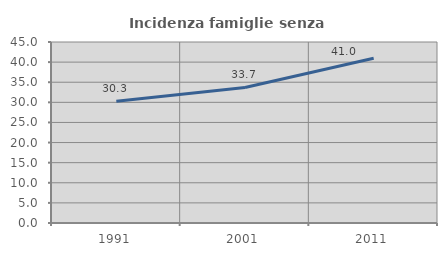
| Category | Incidenza famiglie senza nuclei |
|---|---|
| 1991.0 | 30.291 |
| 2001.0 | 33.708 |
| 2011.0 | 40.957 |